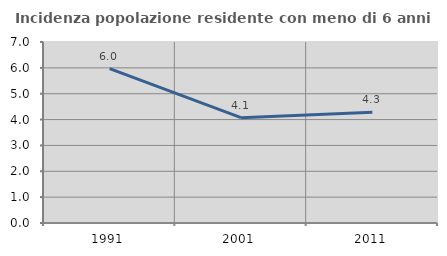
| Category | Incidenza popolazione residente con meno di 6 anni |
|---|---|
| 1991.0 | 5.967 |
| 2001.0 | 4.073 |
| 2011.0 | 4.283 |